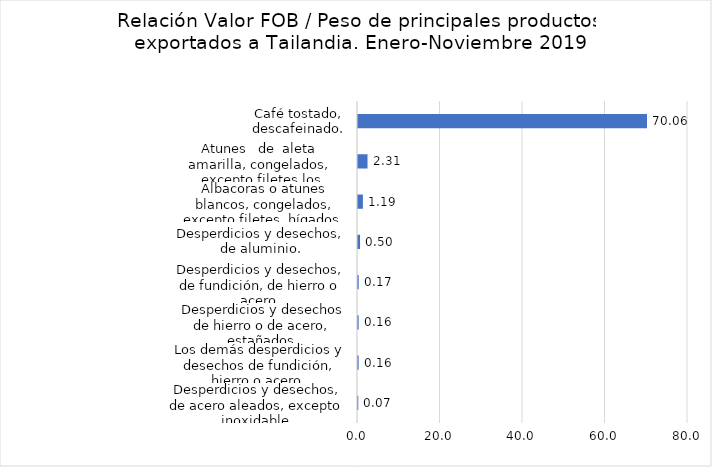
| Category | Series 0 |
|---|---|
| Desperdicios y desechos, de acero aleados, excepto inoxidable. | 0.068 |
| Los demás desperdicios y desechos de fundición, hierro o acero. | 0.159 |
| Desperdicios y desechos de hierro o de acero, estañados. | 0.162 |
| Desperdicios y desechos, de fundición, de hierro o acero. | 0.171 |
| Desperdicios y desechos, de aluminio. | 0.5 |
| Albacoras o atunes blancos, congelados, excepto filetes, hígados, huevas y lechas. | 1.187 |
| Atunes   de  aleta  amarilla, congelados,  excepto filetes los hígados, huevas y lechas | 2.31 |
| Café tostado, descafeinado. | 70.065 |